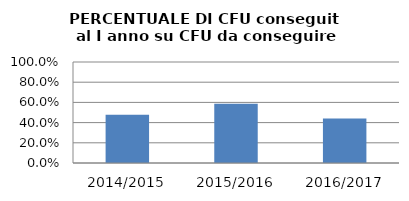
| Category | 2014/2015 2015/2016 2016/2017 |
|---|---|
| 2014/2015 | 0.477 |
| 2015/2016 | 0.586 |
| 2016/2017 | 0.441 |